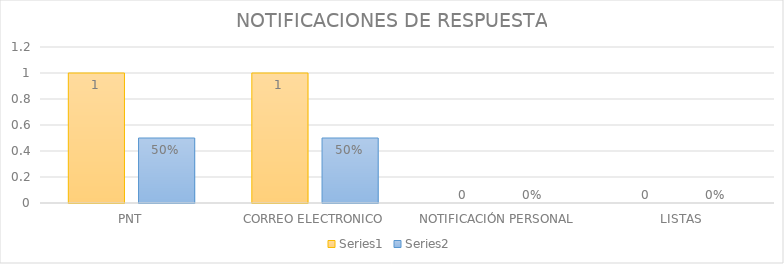
| Category | Series 3 | Series 4 |
|---|---|---|
| PNT | 1 | 0.5 |
| CORREO ELECTRONICO | 1 | 0.5 |
| NOTIFICACIÓN PERSONAL | 0 | 0 |
| LISTAS | 0 | 0 |